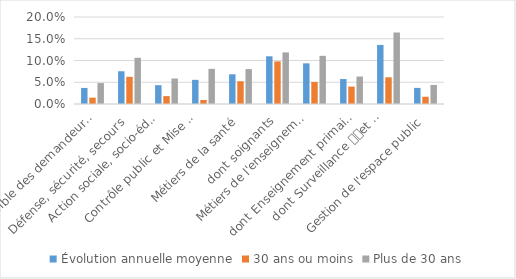
| Category | Évolution annuelle moyenne | 30 ans ou moins | Plus de 30 ans |
|---|---|---|---|
| Ensemble des demandeurs d'emploi | 0.037 | 0.015 | 0.048 |
| Défense, sécurité, secours | 0.075 | 0.063 | 0.106 |
| Action sociale, socio-éducative
 et socio-culturelle | 0.043 | 0.018 | 0.059 |
| Contrôle public et Mise en place 
des politiques publiques, territoriales et de l'emploi | 0.056 | 0.009 | 0.081 |
| Métiers de la santé | 0.068 | 0.052 | 0.08 |
| dont soignants | 0.11 | 0.098 | 0.119 |
| Métiers de l'enseignement 
et de la recherche | 0.093 | 0.051 | 0.111 |
| dont Enseignement primaire et secondaire | 0.057 | 0.04 | 0.063 |
| dont Surveillance 
et autres métiers de l'enseignement | 0.136 | 0.061 | 0.164 |
| Gestion de l'espace public | 0.037 | 0.017 | 0.044 |